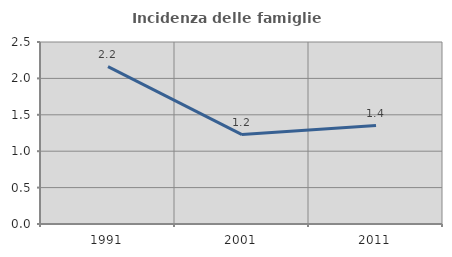
| Category | Incidenza delle famiglie numerose |
|---|---|
| 1991.0 | 2.163 |
| 2001.0 | 1.228 |
| 2011.0 | 1.353 |